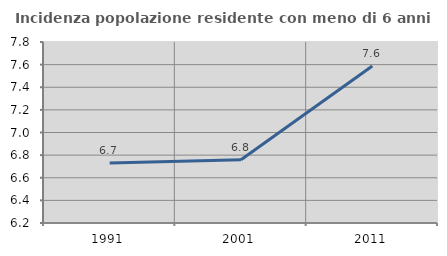
| Category | Incidenza popolazione residente con meno di 6 anni |
|---|---|
| 1991.0 | 6.73 |
| 2001.0 | 6.759 |
| 2011.0 | 7.589 |